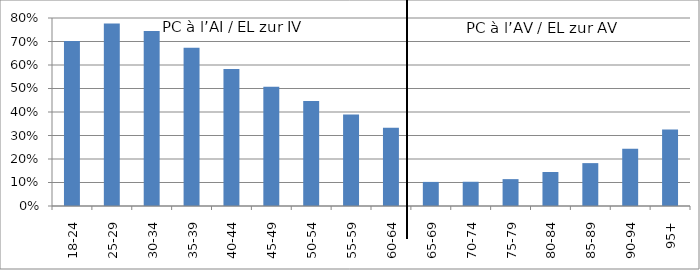
| Category | PC à l’AI / EL zur IV PC à l’AV / EL zur AV |
|---|---|
| 18-24 | 0.702 |
| 25-29 | 0.776 |
| 30-34 | 0.744 |
| 35-39 | 0.673 |
| 40-44 | 0.583 |
| 45-49 | 0.508 |
| 50-54 | 0.447 |
| 55-59 | 0.389 |
| 60-64 | 0.333 |
| 65-69 | 0.103 |
| 70-74 | 0.103 |
| 75-79 | 0.114 |
| 80-84 | 0.145 |
| 85-89 | 0.182 |
| 90-94 | 0.243 |
| 95+ | 0.325 |